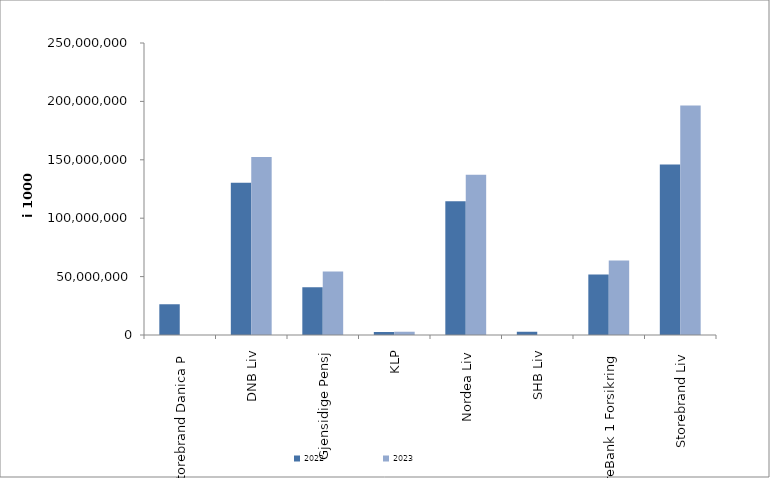
| Category | 2022 | 2023 |
|---|---|---|
| Storebrand Danica P | 26321708.567 | 0 |
| DNB Liv | 130260212 | 152437302 |
| Gjensidige Pensj | 40777682 | 54371233 |
| KLP | 2589206.35 | 2792444.491 |
| Nordea Liv | 114500280 | 137257750 |
| SHB Liv | 2775030.137 | 0 |
| SpareBank 1 Forsikring | 51842088.698 | 63741211.108 |
| Storebrand Liv | 145912125.619 | 196541367.019 |